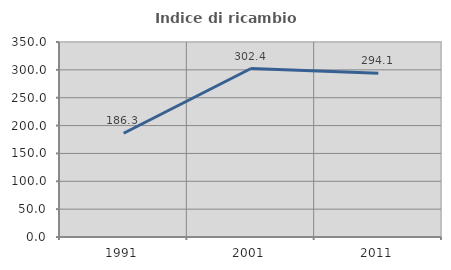
| Category | Indice di ricambio occupazionale  |
|---|---|
| 1991.0 | 186.275 |
| 2001.0 | 302.415 |
| 2011.0 | 294.068 |